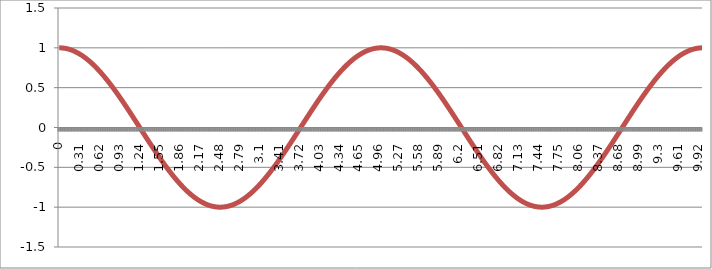
| Category | Series 0 |
|---|---|
| 0.0 | 1 |
| 0.01 | 1 |
| 0.02 | 1 |
| 0.03 | 0.999 |
| 0.04 | 0.999 |
| 0.05 | 0.998 |
| 0.060000000000000005 | 0.997 |
| 0.07 | 0.996 |
| 0.08 | 0.995 |
| 0.09 | 0.994 |
| 0.09999999999999999 | 0.992 |
| 0.10999999999999999 | 0.99 |
| 0.11999999999999998 | 0.989 |
| 0.12999999999999998 | 0.987 |
| 0.13999999999999999 | 0.985 |
| 0.15 | 0.982 |
| 0.16 | 0.98 |
| 0.17 | 0.977 |
| 0.18000000000000002 | 0.975 |
| 0.19000000000000003 | 0.972 |
| 0.20000000000000004 | 0.969 |
| 0.21000000000000005 | 0.965 |
| 0.22000000000000006 | 0.962 |
| 0.23000000000000007 | 0.959 |
| 0.24000000000000007 | 0.955 |
| 0.25000000000000006 | 0.951 |
| 0.26000000000000006 | 0.947 |
| 0.2700000000000001 | 0.943 |
| 0.2800000000000001 | 0.939 |
| 0.2900000000000001 | 0.934 |
| 0.3000000000000001 | 0.93 |
| 0.3100000000000001 | 0.925 |
| 0.3200000000000001 | 0.92 |
| 0.3300000000000001 | 0.915 |
| 0.34000000000000014 | 0.91 |
| 0.35000000000000014 | 0.905 |
| 0.36000000000000015 | 0.899 |
| 0.37000000000000016 | 0.894 |
| 0.38000000000000017 | 0.888 |
| 0.3900000000000002 | 0.882 |
| 0.4000000000000002 | 0.876 |
| 0.4100000000000002 | 0.87 |
| 0.4200000000000002 | 0.864 |
| 0.4300000000000002 | 0.858 |
| 0.4400000000000002 | 0.851 |
| 0.45000000000000023 | 0.844 |
| 0.46000000000000024 | 0.838 |
| 0.47000000000000025 | 0.831 |
| 0.48000000000000026 | 0.824 |
| 0.49000000000000027 | 0.816 |
| 0.5000000000000002 | 0.809 |
| 0.5100000000000002 | 0.802 |
| 0.5200000000000002 | 0.794 |
| 0.5300000000000002 | 0.786 |
| 0.5400000000000003 | 0.778 |
| 0.5500000000000003 | 0.771 |
| 0.5600000000000003 | 0.762 |
| 0.5700000000000003 | 0.754 |
| 0.5800000000000003 | 0.746 |
| 0.5900000000000003 | 0.738 |
| 0.6000000000000003 | 0.729 |
| 0.6100000000000003 | 0.72 |
| 0.6200000000000003 | 0.712 |
| 0.6300000000000003 | 0.703 |
| 0.6400000000000003 | 0.694 |
| 0.6500000000000004 | 0.685 |
| 0.6600000000000004 | 0.675 |
| 0.6700000000000004 | 0.666 |
| 0.6800000000000004 | 0.657 |
| 0.6900000000000004 | 0.647 |
| 0.7000000000000004 | 0.637 |
| 0.7100000000000004 | 0.628 |
| 0.7200000000000004 | 0.618 |
| 0.7300000000000004 | 0.608 |
| 0.7400000000000004 | 0.598 |
| 0.7500000000000004 | 0.588 |
| 0.7600000000000005 | 0.578 |
| 0.7700000000000005 | 0.567 |
| 0.7800000000000005 | 0.557 |
| 0.7900000000000005 | 0.546 |
| 0.8000000000000005 | 0.536 |
| 0.8100000000000005 | 0.525 |
| 0.8200000000000005 | 0.514 |
| 0.8300000000000005 | 0.504 |
| 0.8400000000000005 | 0.493 |
| 0.8500000000000005 | 0.482 |
| 0.8600000000000005 | 0.471 |
| 0.8700000000000006 | 0.46 |
| 0.8800000000000006 | 0.448 |
| 0.8900000000000006 | 0.437 |
| 0.9000000000000006 | 0.426 |
| 0.9100000000000006 | 0.414 |
| 0.9200000000000006 | 0.403 |
| 0.9300000000000006 | 0.391 |
| 0.9400000000000006 | 0.38 |
| 0.9500000000000006 | 0.368 |
| 0.9600000000000006 | 0.356 |
| 0.9700000000000006 | 0.345 |
| 0.9800000000000006 | 0.333 |
| 0.9900000000000007 | 0.321 |
| 1.0000000000000007 | 0.309 |
| 1.0100000000000007 | 0.297 |
| 1.0200000000000007 | 0.285 |
| 1.0300000000000007 | 0.273 |
| 1.0400000000000007 | 0.261 |
| 1.0500000000000007 | 0.249 |
| 1.0600000000000007 | 0.236 |
| 1.0700000000000007 | 0.224 |
| 1.0800000000000007 | 0.212 |
| 1.0900000000000007 | 0.2 |
| 1.1000000000000008 | 0.187 |
| 1.1100000000000008 | 0.175 |
| 1.1200000000000008 | 0.163 |
| 1.1300000000000008 | 0.15 |
| 1.1400000000000008 | 0.138 |
| 1.1500000000000008 | 0.125 |
| 1.1600000000000008 | 0.113 |
| 1.1700000000000008 | 0.1 |
| 1.1800000000000008 | 0.088 |
| 1.1900000000000008 | 0.075 |
| 1.2000000000000008 | 0.063 |
| 1.2100000000000009 | 0.05 |
| 1.2200000000000009 | 0.038 |
| 1.2300000000000009 | 0.025 |
| 1.2400000000000009 | 0.013 |
| 1.2500000000000009 | 0 |
| 1.260000000000001 | -0.013 |
| 1.270000000000001 | -0.025 |
| 1.280000000000001 | -0.038 |
| 1.290000000000001 | -0.05 |
| 1.300000000000001 | -0.063 |
| 1.310000000000001 | -0.075 |
| 1.320000000000001 | -0.088 |
| 1.330000000000001 | -0.1 |
| 1.340000000000001 | -0.113 |
| 1.350000000000001 | -0.125 |
| 1.360000000000001 | -0.138 |
| 1.370000000000001 | -0.15 |
| 1.380000000000001 | -0.163 |
| 1.390000000000001 | -0.175 |
| 1.400000000000001 | -0.187 |
| 1.410000000000001 | -0.2 |
| 1.420000000000001 | -0.212 |
| 1.430000000000001 | -0.224 |
| 1.440000000000001 | -0.236 |
| 1.450000000000001 | -0.249 |
| 1.460000000000001 | -0.261 |
| 1.470000000000001 | -0.273 |
| 1.480000000000001 | -0.285 |
| 1.490000000000001 | -0.297 |
| 1.500000000000001 | -0.309 |
| 1.5100000000000011 | -0.321 |
| 1.5200000000000011 | -0.333 |
| 1.5300000000000011 | -0.345 |
| 1.5400000000000011 | -0.356 |
| 1.5500000000000012 | -0.368 |
| 1.5600000000000012 | -0.38 |
| 1.5700000000000012 | -0.391 |
| 1.5800000000000012 | -0.403 |
| 1.5900000000000012 | -0.414 |
| 1.6000000000000012 | -0.426 |
| 1.6100000000000012 | -0.437 |
| 1.6200000000000012 | -0.448 |
| 1.6300000000000012 | -0.46 |
| 1.6400000000000012 | -0.471 |
| 1.6500000000000012 | -0.482 |
| 1.6600000000000013 | -0.493 |
| 1.6700000000000013 | -0.504 |
| 1.6800000000000013 | -0.514 |
| 1.6900000000000013 | -0.525 |
| 1.7000000000000013 | -0.536 |
| 1.7100000000000013 | -0.546 |
| 1.7200000000000013 | -0.557 |
| 1.7300000000000013 | -0.567 |
| 1.7400000000000013 | -0.578 |
| 1.7500000000000013 | -0.588 |
| 1.7600000000000013 | -0.598 |
| 1.7700000000000014 | -0.608 |
| 1.7800000000000014 | -0.618 |
| 1.7900000000000014 | -0.628 |
| 1.8000000000000014 | -0.637 |
| 1.8100000000000014 | -0.647 |
| 1.8200000000000014 | -0.657 |
| 1.8300000000000014 | -0.666 |
| 1.8400000000000014 | -0.675 |
| 1.8500000000000014 | -0.685 |
| 1.8600000000000014 | -0.694 |
| 1.8700000000000014 | -0.703 |
| 1.8800000000000014 | -0.712 |
| 1.8900000000000015 | -0.72 |
| 1.9000000000000015 | -0.729 |
| 1.9100000000000015 | -0.738 |
| 1.9200000000000015 | -0.746 |
| 1.9300000000000015 | -0.754 |
| 1.9400000000000015 | -0.762 |
| 1.9500000000000015 | -0.771 |
| 1.9600000000000015 | -0.778 |
| 1.9700000000000015 | -0.786 |
| 1.9800000000000015 | -0.794 |
| 1.9900000000000015 | -0.802 |
| 2.0000000000000013 | -0.809 |
| 2.010000000000001 | -0.816 |
| 2.020000000000001 | -0.824 |
| 2.0300000000000007 | -0.831 |
| 2.0400000000000005 | -0.838 |
| 2.0500000000000003 | -0.844 |
| 2.06 | -0.851 |
| 2.07 | -0.858 |
| 2.0799999999999996 | -0.864 |
| 2.0899999999999994 | -0.87 |
| 2.099999999999999 | -0.876 |
| 2.109999999999999 | -0.882 |
| 2.1199999999999988 | -0.888 |
| 2.1299999999999986 | -0.894 |
| 2.1399999999999983 | -0.899 |
| 2.149999999999998 | -0.905 |
| 2.159999999999998 | -0.91 |
| 2.1699999999999977 | -0.915 |
| 2.1799999999999975 | -0.92 |
| 2.1899999999999973 | -0.925 |
| 2.199999999999997 | -0.93 |
| 2.209999999999997 | -0.934 |
| 2.2199999999999966 | -0.939 |
| 2.2299999999999964 | -0.943 |
| 2.239999999999996 | -0.947 |
| 2.249999999999996 | -0.951 |
| 2.259999999999996 | -0.955 |
| 2.2699999999999956 | -0.959 |
| 2.2799999999999954 | -0.962 |
| 2.289999999999995 | -0.965 |
| 2.299999999999995 | -0.969 |
| 2.3099999999999947 | -0.972 |
| 2.3199999999999945 | -0.975 |
| 2.3299999999999943 | -0.977 |
| 2.339999999999994 | -0.98 |
| 2.349999999999994 | -0.982 |
| 2.3599999999999937 | -0.985 |
| 2.3699999999999934 | -0.987 |
| 2.3799999999999932 | -0.989 |
| 2.389999999999993 | -0.99 |
| 2.399999999999993 | -0.992 |
| 2.4099999999999926 | -0.994 |
| 2.4199999999999924 | -0.995 |
| 2.429999999999992 | -0.996 |
| 2.439999999999992 | -0.997 |
| 2.4499999999999917 | -0.998 |
| 2.4599999999999915 | -0.999 |
| 2.4699999999999913 | -0.999 |
| 2.479999999999991 | -1 |
| 2.489999999999991 | -1 |
| 2.4999999999999907 | -1 |
| 2.5099999999999905 | -1 |
| 2.5199999999999902 | -1 |
| 2.52999999999999 | -0.999 |
| 2.53999999999999 | -0.999 |
| 2.5499999999999896 | -0.998 |
| 2.5599999999999894 | -0.997 |
| 2.569999999999989 | -0.996 |
| 2.579999999999989 | -0.995 |
| 2.5899999999999888 | -0.994 |
| 2.5999999999999885 | -0.992 |
| 2.6099999999999883 | -0.99 |
| 2.619999999999988 | -0.989 |
| 2.629999999999988 | -0.987 |
| 2.6399999999999877 | -0.985 |
| 2.6499999999999875 | -0.982 |
| 2.6599999999999873 | -0.98 |
| 2.669999999999987 | -0.977 |
| 2.679999999999987 | -0.975 |
| 2.6899999999999866 | -0.972 |
| 2.6999999999999864 | -0.969 |
| 2.709999999999986 | -0.965 |
| 2.719999999999986 | -0.962 |
| 2.7299999999999858 | -0.959 |
| 2.7399999999999856 | -0.955 |
| 2.7499999999999853 | -0.951 |
| 2.759999999999985 | -0.947 |
| 2.769999999999985 | -0.943 |
| 2.7799999999999847 | -0.939 |
| 2.7899999999999845 | -0.934 |
| 2.7999999999999843 | -0.93 |
| 2.809999999999984 | -0.925 |
| 2.819999999999984 | -0.92 |
| 2.8299999999999836 | -0.915 |
| 2.8399999999999834 | -0.91 |
| 2.849999999999983 | -0.905 |
| 2.859999999999983 | -0.899 |
| 2.869999999999983 | -0.894 |
| 2.8799999999999826 | -0.888 |
| 2.8899999999999824 | -0.882 |
| 2.899999999999982 | -0.876 |
| 2.909999999999982 | -0.87 |
| 2.9199999999999817 | -0.864 |
| 2.9299999999999815 | -0.858 |
| 2.9399999999999813 | -0.851 |
| 2.949999999999981 | -0.844 |
| 2.959999999999981 | -0.838 |
| 2.9699999999999807 | -0.831 |
| 2.9799999999999804 | -0.824 |
| 2.9899999999999802 | -0.816 |
| 2.99999999999998 | -0.809 |
| 3.00999999999998 | -0.802 |
| 3.0199999999999796 | -0.794 |
| 3.0299999999999794 | -0.786 |
| 3.039999999999979 | -0.778 |
| 3.049999999999979 | -0.771 |
| 3.0599999999999787 | -0.762 |
| 3.0699999999999785 | -0.754 |
| 3.0799999999999783 | -0.746 |
| 3.089999999999978 | -0.738 |
| 3.099999999999978 | -0.729 |
| 3.1099999999999777 | -0.72 |
| 3.1199999999999775 | -0.712 |
| 3.1299999999999772 | -0.703 |
| 3.139999999999977 | -0.694 |
| 3.149999999999977 | -0.685 |
| 3.1599999999999766 | -0.675 |
| 3.1699999999999764 | -0.666 |
| 3.179999999999976 | -0.657 |
| 3.189999999999976 | -0.647 |
| 3.1999999999999758 | -0.637 |
| 3.2099999999999755 | -0.628 |
| 3.2199999999999753 | -0.618 |
| 3.229999999999975 | -0.608 |
| 3.239999999999975 | -0.598 |
| 3.2499999999999747 | -0.588 |
| 3.2599999999999745 | -0.578 |
| 3.2699999999999743 | -0.567 |
| 3.279999999999974 | -0.557 |
| 3.289999999999974 | -0.546 |
| 3.2999999999999736 | -0.536 |
| 3.3099999999999734 | -0.525 |
| 3.319999999999973 | -0.514 |
| 3.329999999999973 | -0.504 |
| 3.3399999999999728 | -0.493 |
| 3.3499999999999726 | -0.482 |
| 3.3599999999999723 | -0.471 |
| 3.369999999999972 | -0.46 |
| 3.379999999999972 | -0.448 |
| 3.3899999999999717 | -0.437 |
| 3.3999999999999715 | -0.426 |
| 3.4099999999999713 | -0.414 |
| 3.419999999999971 | -0.403 |
| 3.429999999999971 | -0.391 |
| 3.4399999999999706 | -0.38 |
| 3.4499999999999704 | -0.368 |
| 3.45999999999997 | -0.356 |
| 3.46999999999997 | -0.345 |
| 3.47999999999997 | -0.333 |
| 3.4899999999999696 | -0.321 |
| 3.4999999999999694 | -0.309 |
| 3.509999999999969 | -0.297 |
| 3.519999999999969 | -0.285 |
| 3.5299999999999687 | -0.273 |
| 3.5399999999999685 | -0.261 |
| 3.5499999999999683 | -0.249 |
| 3.559999999999968 | -0.236 |
| 3.569999999999968 | -0.224 |
| 3.5799999999999677 | -0.212 |
| 3.5899999999999674 | -0.2 |
| 3.5999999999999672 | -0.187 |
| 3.609999999999967 | -0.175 |
| 3.619999999999967 | -0.163 |
| 3.6299999999999666 | -0.15 |
| 3.6399999999999664 | -0.138 |
| 3.649999999999966 | -0.125 |
| 3.659999999999966 | -0.113 |
| 3.6699999999999657 | -0.1 |
| 3.6799999999999655 | -0.088 |
| 3.6899999999999653 | -0.075 |
| 3.699999999999965 | -0.063 |
| 3.709999999999965 | -0.05 |
| 3.7199999999999647 | -0.038 |
| 3.7299999999999645 | -0.025 |
| 3.7399999999999642 | -0.013 |
| 3.749999999999964 | 0 |
| 3.759999999999964 | 0.013 |
| 3.7699999999999636 | 0.025 |
| 3.7799999999999634 | 0.038 |
| 3.789999999999963 | 0.05 |
| 3.799999999999963 | 0.063 |
| 3.8099999999999627 | 0.075 |
| 3.8199999999999625 | 0.088 |
| 3.8299999999999623 | 0.1 |
| 3.839999999999962 | 0.113 |
| 3.849999999999962 | 0.125 |
| 3.8599999999999617 | 0.138 |
| 3.8699999999999615 | 0.15 |
| 3.8799999999999613 | 0.163 |
| 3.889999999999961 | 0.175 |
| 3.899999999999961 | 0.187 |
| 3.9099999999999606 | 0.2 |
| 3.9199999999999604 | 0.212 |
| 3.92999999999996 | 0.224 |
| 3.93999999999996 | 0.236 |
| 3.9499999999999598 | 0.249 |
| 3.9599999999999596 | 0.261 |
| 3.9699999999999593 | 0.273 |
| 3.979999999999959 | 0.285 |
| 3.989999999999959 | 0.297 |
| 3.9999999999999587 | 0.309 |
| 4.009999999999959 | 0.321 |
| 4.019999999999959 | 0.333 |
| 4.0299999999999585 | 0.345 |
| 4.039999999999958 | 0.356 |
| 4.049999999999958 | 0.368 |
| 4.059999999999958 | 0.38 |
| 4.069999999999958 | 0.391 |
| 4.079999999999957 | 0.403 |
| 4.089999999999957 | 0.414 |
| 4.099999999999957 | 0.426 |
| 4.109999999999957 | 0.437 |
| 4.119999999999957 | 0.448 |
| 4.129999999999956 | 0.46 |
| 4.139999999999956 | 0.471 |
| 4.149999999999956 | 0.482 |
| 4.159999999999956 | 0.493 |
| 4.1699999999999555 | 0.504 |
| 4.179999999999955 | 0.514 |
| 4.189999999999955 | 0.525 |
| 4.199999999999955 | 0.536 |
| 4.209999999999955 | 0.546 |
| 4.2199999999999545 | 0.557 |
| 4.229999999999954 | 0.567 |
| 4.239999999999954 | 0.578 |
| 4.249999999999954 | 0.588 |
| 4.259999999999954 | 0.598 |
| 4.269999999999953 | 0.608 |
| 4.279999999999953 | 0.618 |
| 4.289999999999953 | 0.628 |
| 4.299999999999953 | 0.637 |
| 4.3099999999999525 | 0.647 |
| 4.319999999999952 | 0.657 |
| 4.329999999999952 | 0.666 |
| 4.339999999999952 | 0.675 |
| 4.349999999999952 | 0.685 |
| 4.3599999999999515 | 0.694 |
| 4.369999999999951 | 0.703 |
| 4.379999999999951 | 0.712 |
| 4.389999999999951 | 0.72 |
| 4.399999999999951 | 0.729 |
| 4.40999999999995 | 0.738 |
| 4.41999999999995 | 0.746 |
| 4.42999999999995 | 0.754 |
| 4.43999999999995 | 0.762 |
| 4.4499999999999496 | 0.771 |
| 4.459999999999949 | 0.778 |
| 4.469999999999949 | 0.786 |
| 4.479999999999949 | 0.794 |
| 4.489999999999949 | 0.802 |
| 4.4999999999999485 | 0.809 |
| 4.509999999999948 | 0.816 |
| 4.519999999999948 | 0.824 |
| 4.529999999999948 | 0.831 |
| 4.539999999999948 | 0.838 |
| 4.549999999999947 | 0.844 |
| 4.559999999999947 | 0.851 |
| 4.569999999999947 | 0.858 |
| 4.579999999999947 | 0.864 |
| 4.589999999999947 | 0.87 |
| 4.599999999999946 | 0.876 |
| 4.609999999999946 | 0.882 |
| 4.619999999999946 | 0.888 |
| 4.629999999999946 | 0.894 |
| 4.6399999999999455 | 0.899 |
| 4.649999999999945 | 0.905 |
| 4.659999999999945 | 0.91 |
| 4.669999999999945 | 0.915 |
| 4.679999999999945 | 0.92 |
| 4.689999999999944 | 0.925 |
| 4.699999999999944 | 0.93 |
| 4.709999999999944 | 0.934 |
| 4.719999999999944 | 0.939 |
| 4.729999999999944 | 0.943 |
| 4.739999999999943 | 0.947 |
| 4.749999999999943 | 0.951 |
| 4.759999999999943 | 0.955 |
| 4.769999999999943 | 0.959 |
| 4.7799999999999425 | 0.962 |
| 4.789999999999942 | 0.965 |
| 4.799999999999942 | 0.969 |
| 4.809999999999942 | 0.972 |
| 4.819999999999942 | 0.975 |
| 4.8299999999999415 | 0.977 |
| 4.839999999999941 | 0.98 |
| 4.849999999999941 | 0.982 |
| 4.859999999999941 | 0.985 |
| 4.869999999999941 | 0.987 |
| 4.87999999999994 | 0.989 |
| 4.88999999999994 | 0.99 |
| 4.89999999999994 | 0.992 |
| 4.90999999999994 | 0.994 |
| 4.9199999999999395 | 0.995 |
| 4.929999999999939 | 0.996 |
| 4.939999999999939 | 0.997 |
| 4.949999999999939 | 0.998 |
| 4.959999999999939 | 0.999 |
| 4.9699999999999385 | 0.999 |
| 4.979999999999938 | 1 |
| 4.989999999999938 | 1 |
| 4.999999999999938 | 1 |
| 5.009999999999938 | 1 |
| 5.019999999999937 | 1 |
| 5.029999999999937 | 0.999 |
| 5.039999999999937 | 0.999 |
| 5.049999999999937 | 0.998 |
| 5.0599999999999365 | 0.997 |
| 5.069999999999936 | 0.996 |
| 5.079999999999936 | 0.995 |
| 5.089999999999936 | 0.994 |
| 5.099999999999936 | 0.992 |
| 5.1099999999999355 | 0.99 |
| 5.119999999999935 | 0.989 |
| 5.129999999999935 | 0.987 |
| 5.139999999999935 | 0.985 |
| 5.149999999999935 | 0.982 |
| 5.159999999999934 | 0.98 |
| 5.169999999999934 | 0.977 |
| 5.179999999999934 | 0.975 |
| 5.189999999999934 | 0.972 |
| 5.199999999999934 | 0.969 |
| 5.209999999999933 | 0.965 |
| 5.219999999999933 | 0.962 |
| 5.229999999999933 | 0.959 |
| 5.239999999999933 | 0.955 |
| 5.2499999999999325 | 0.951 |
| 5.259999999999932 | 0.947 |
| 5.269999999999932 | 0.943 |
| 5.279999999999932 | 0.939 |
| 5.289999999999932 | 0.934 |
| 5.299999999999931 | 0.93 |
| 5.309999999999931 | 0.925 |
| 5.319999999999931 | 0.92 |
| 5.329999999999931 | 0.915 |
| 5.339999999999931 | 0.91 |
| 5.34999999999993 | 0.905 |
| 5.35999999999993 | 0.899 |
| 5.36999999999993 | 0.894 |
| 5.37999999999993 | 0.888 |
| 5.3899999999999295 | 0.882 |
| 5.399999999999929 | 0.876 |
| 5.409999999999929 | 0.87 |
| 5.419999999999929 | 0.864 |
| 5.429999999999929 | 0.858 |
| 5.4399999999999284 | 0.851 |
| 5.449999999999928 | 0.844 |
| 5.459999999999928 | 0.838 |
| 5.469999999999928 | 0.831 |
| 5.479999999999928 | 0.824 |
| 5.489999999999927 | 0.816 |
| 5.499999999999927 | 0.809 |
| 5.509999999999927 | 0.802 |
| 5.519999999999927 | 0.794 |
| 5.5299999999999265 | 0.786 |
| 5.539999999999926 | 0.778 |
| 5.549999999999926 | 0.771 |
| 5.559999999999926 | 0.762 |
| 5.569999999999926 | 0.754 |
| 5.5799999999999255 | 0.746 |
| 5.589999999999925 | 0.738 |
| 5.599999999999925 | 0.729 |
| 5.609999999999925 | 0.72 |
| 5.619999999999925 | 0.712 |
| 5.629999999999924 | 0.703 |
| 5.639999999999924 | 0.694 |
| 5.649999999999924 | 0.685 |
| 5.659999999999924 | 0.675 |
| 5.6699999999999235 | 0.666 |
| 5.679999999999923 | 0.657 |
| 5.689999999999923 | 0.647 |
| 5.699999999999923 | 0.637 |
| 5.709999999999923 | 0.628 |
| 5.7199999999999225 | 0.618 |
| 5.729999999999922 | 0.608 |
| 5.739999999999922 | 0.598 |
| 5.749999999999922 | 0.588 |
| 5.759999999999922 | 0.578 |
| 5.769999999999921 | 0.567 |
| 5.779999999999921 | 0.557 |
| 5.789999999999921 | 0.546 |
| 5.799999999999921 | 0.536 |
| 5.809999999999921 | 0.525 |
| 5.81999999999992 | 0.514 |
| 5.82999999999992 | 0.504 |
| 5.83999999999992 | 0.493 |
| 5.84999999999992 | 0.482 |
| 5.8599999999999195 | 0.471 |
| 5.869999999999919 | 0.46 |
| 5.879999999999919 | 0.448 |
| 5.889999999999919 | 0.437 |
| 5.899999999999919 | 0.426 |
| 5.909999999999918 | 0.414 |
| 5.919999999999918 | 0.403 |
| 5.929999999999918 | 0.391 |
| 5.939999999999918 | 0.38 |
| 5.949999999999918 | 0.368 |
| 5.959999999999917 | 0.356 |
| 5.969999999999917 | 0.345 |
| 5.979999999999917 | 0.333 |
| 5.989999999999917 | 0.321 |
| 5.9999999999999165 | 0.309 |
| 6.009999999999916 | 0.297 |
| 6.019999999999916 | 0.285 |
| 6.029999999999916 | 0.273 |
| 6.039999999999916 | 0.261 |
| 6.0499999999999154 | 0.249 |
| 6.059999999999915 | 0.236 |
| 6.069999999999915 | 0.224 |
| 6.079999999999915 | 0.212 |
| 6.089999999999915 | 0.2 |
| 6.099999999999914 | 0.187 |
| 6.109999999999914 | 0.175 |
| 6.119999999999914 | 0.163 |
| 6.129999999999914 | 0.15 |
| 6.1399999999999135 | 0.138 |
| 6.149999999999913 | 0.125 |
| 6.159999999999913 | 0.113 |
| 6.169999999999913 | 0.1 |
| 6.179999999999913 | 0.088 |
| 6.1899999999999125 | 0.075 |
| 6.199999999999912 | 0.063 |
| 6.209999999999912 | 0.05 |
| 6.219999999999912 | 0.038 |
| 6.229999999999912 | 0.025 |
| 6.239999999999911 | 0.013 |
| 6.249999999999911 | 0 |
| 6.259999999999911 | -0.013 |
| 6.269999999999911 | -0.025 |
| 6.2799999999999105 | -0.038 |
| 6.28999999999991 | -0.05 |
| 6.29999999999991 | -0.063 |
| 6.30999999999991 | -0.075 |
| 6.31999999999991 | -0.088 |
| 6.3299999999999095 | -0.1 |
| 6.339999999999909 | -0.113 |
| 6.349999999999909 | -0.125 |
| 6.359999999999909 | -0.138 |
| 6.369999999999909 | -0.15 |
| 6.379999999999908 | -0.163 |
| 6.389999999999908 | -0.175 |
| 6.399999999999908 | -0.187 |
| 6.409999999999908 | -0.2 |
| 6.419999999999908 | -0.212 |
| 6.429999999999907 | -0.224 |
| 6.439999999999907 | -0.236 |
| 6.449999999999907 | -0.249 |
| 6.459999999999907 | -0.261 |
| 6.4699999999999065 | -0.273 |
| 6.479999999999906 | -0.285 |
| 6.489999999999906 | -0.297 |
| 6.499999999999906 | -0.309 |
| 6.509999999999906 | -0.321 |
| 6.519999999999905 | -0.333 |
| 6.529999999999905 | -0.345 |
| 6.539999999999905 | -0.356 |
| 6.549999999999905 | -0.368 |
| 6.559999999999905 | -0.38 |
| 6.569999999999904 | -0.391 |
| 6.579999999999904 | -0.403 |
| 6.589999999999904 | -0.414 |
| 6.599999999999904 | -0.426 |
| 6.6099999999999035 | -0.437 |
| 6.619999999999903 | -0.448 |
| 6.629999999999903 | -0.46 |
| 6.639999999999903 | -0.471 |
| 6.649999999999903 | -0.482 |
| 6.659999999999902 | -0.493 |
| 6.669999999999902 | -0.504 |
| 6.679999999999902 | -0.514 |
| 6.689999999999902 | -0.525 |
| 6.699999999999902 | -0.536 |
| 6.709999999999901 | -0.546 |
| 6.719999999999901 | -0.557 |
| 6.729999999999901 | -0.567 |
| 6.739999999999901 | -0.578 |
| 6.7499999999999005 | -0.588 |
| 6.7599999999999 | -0.598 |
| 6.7699999999999 | -0.608 |
| 6.7799999999999 | -0.618 |
| 6.7899999999999 | -0.628 |
| 6.7999999999998995 | -0.637 |
| 6.809999999999899 | -0.647 |
| 6.819999999999899 | -0.657 |
| 6.829999999999899 | -0.666 |
| 6.839999999999899 | -0.675 |
| 6.849999999999898 | -0.685 |
| 6.859999999999898 | -0.694 |
| 6.869999999999898 | -0.703 |
| 6.879999999999898 | -0.712 |
| 6.8899999999998975 | -0.72 |
| 6.899999999999897 | -0.729 |
| 6.909999999999897 | -0.738 |
| 6.919999999999897 | -0.746 |
| 6.929999999999897 | -0.754 |
| 6.9399999999998965 | -0.762 |
| 6.949999999999896 | -0.771 |
| 6.959999999999896 | -0.778 |
| 6.969999999999896 | -0.786 |
| 6.979999999999896 | -0.794 |
| 6.989999999999895 | -0.802 |
| 6.999999999999895 | -0.809 |
| 7.009999999999895 | -0.816 |
| 7.019999999999895 | -0.824 |
| 7.0299999999998946 | -0.831 |
| 7.039999999999894 | -0.838 |
| 7.049999999999894 | -0.844 |
| 7.059999999999894 | -0.851 |
| 7.069999999999894 | -0.858 |
| 7.0799999999998935 | -0.864 |
| 7.089999999999893 | -0.87 |
| 7.099999999999893 | -0.876 |
| 7.109999999999893 | -0.882 |
| 7.119999999999893 | -0.888 |
| 7.129999999999892 | -0.894 |
| 7.139999999999892 | -0.899 |
| 7.149999999999892 | -0.905 |
| 7.159999999999892 | -0.91 |
| 7.169999999999892 | -0.915 |
| 7.179999999999891 | -0.92 |
| 7.189999999999891 | -0.925 |
| 7.199999999999891 | -0.93 |
| 7.209999999999891 | -0.934 |
| 7.2199999999998905 | -0.939 |
| 7.22999999999989 | -0.943 |
| 7.23999999999989 | -0.947 |
| 7.24999999999989 | -0.951 |
| 7.25999999999989 | -0.955 |
| 7.269999999999889 | -0.959 |
| 7.279999999999889 | -0.962 |
| 7.289999999999889 | -0.965 |
| 7.299999999999889 | -0.969 |
| 7.309999999999889 | -0.972 |
| 7.319999999999888 | -0.975 |
| 7.329999999999888 | -0.977 |
| 7.339999999999888 | -0.98 |
| 7.349999999999888 | -0.982 |
| 7.3599999999998875 | -0.985 |
| 7.369999999999887 | -0.987 |
| 7.379999999999887 | -0.989 |
| 7.389999999999887 | -0.99 |
| 7.399999999999887 | -0.992 |
| 7.4099999999998865 | -0.994 |
| 7.419999999999886 | -0.995 |
| 7.429999999999886 | -0.996 |
| 7.439999999999886 | -0.997 |
| 7.449999999999886 | -0.998 |
| 7.459999999999885 | -0.999 |
| 7.469999999999885 | -0.999 |
| 7.479999999999885 | -1 |
| 7.489999999999885 | -1 |
| 7.4999999999998845 | -1 |
| 7.509999999999884 | -1 |
| 7.519999999999884 | -1 |
| 7.529999999999884 | -0.999 |
| 7.539999999999884 | -0.999 |
| 7.5499999999998835 | -0.998 |
| 7.559999999999883 | -0.997 |
| 7.569999999999883 | -0.996 |
| 7.579999999999883 | -0.995 |
| 7.589999999999883 | -0.994 |
| 7.599999999999882 | -0.992 |
| 7.609999999999882 | -0.99 |
| 7.619999999999882 | -0.989 |
| 7.629999999999882 | -0.987 |
| 7.6399999999998816 | -0.985 |
| 7.649999999999881 | -0.982 |
| 7.659999999999881 | -0.98 |
| 7.669999999999881 | -0.977 |
| 7.679999999999881 | -0.975 |
| 7.6899999999998805 | -0.972 |
| 7.69999999999988 | -0.969 |
| 7.70999999999988 | -0.965 |
| 7.71999999999988 | -0.962 |
| 7.72999999999988 | -0.959 |
| 7.739999999999879 | -0.955 |
| 7.749999999999879 | -0.951 |
| 7.759999999999879 | -0.947 |
| 7.769999999999879 | -0.943 |
| 7.779999999999879 | -0.939 |
| 7.789999999999878 | -0.934 |
| 7.799999999999878 | -0.93 |
| 7.809999999999878 | -0.925 |
| 7.819999999999878 | -0.92 |
| 7.8299999999998775 | -0.915 |
| 7.839999999999877 | -0.91 |
| 7.849999999999877 | -0.905 |
| 7.859999999999877 | -0.899 |
| 7.869999999999877 | -0.894 |
| 7.879999999999876 | -0.888 |
| 7.889999999999876 | -0.882 |
| 7.899999999999876 | -0.876 |
| 7.909999999999876 | -0.87 |
| 7.919999999999876 | -0.864 |
| 7.929999999999875 | -0.858 |
| 7.939999999999875 | -0.851 |
| 7.949999999999875 | -0.844 |
| 7.959999999999875 | -0.838 |
| 7.9699999999998745 | -0.831 |
| 7.979999999999874 | -0.824 |
| 7.989999999999874 | -0.816 |
| 7.999999999999874 | -0.809 |
| 8.009999999999874 | -0.802 |
| 8.019999999999873 | -0.794 |
| 8.029999999999873 | -0.786 |
| 8.039999999999873 | -0.778 |
| 8.049999999999873 | -0.771 |
| 8.059999999999873 | -0.762 |
| 8.069999999999872 | -0.754 |
| 8.079999999999872 | -0.746 |
| 8.089999999999872 | -0.738 |
| 8.099999999999872 | -0.729 |
| 8.109999999999872 | -0.72 |
| 8.119999999999871 | -0.712 |
| 8.129999999999871 | -0.703 |
| 8.139999999999871 | -0.694 |
| 8.14999999999987 | -0.685 |
| 8.15999999999987 | -0.675 |
| 8.16999999999987 | -0.666 |
| 8.17999999999987 | -0.657 |
| 8.18999999999987 | -0.647 |
| 8.19999999999987 | -0.637 |
| 8.20999999999987 | -0.628 |
| 8.21999999999987 | -0.618 |
| 8.229999999999869 | -0.608 |
| 8.239999999999869 | -0.598 |
| 8.249999999999869 | -0.588 |
| 8.259999999999868 | -0.578 |
| 8.269999999999868 | -0.567 |
| 8.279999999999868 | -0.557 |
| 8.289999999999868 | -0.546 |
| 8.299999999999867 | -0.536 |
| 8.309999999999867 | -0.525 |
| 8.319999999999867 | -0.514 |
| 8.329999999999867 | -0.504 |
| 8.339999999999867 | -0.493 |
| 8.349999999999866 | -0.482 |
| 8.359999999999866 | -0.471 |
| 8.369999999999866 | -0.46 |
| 8.379999999999866 | -0.448 |
| 8.389999999999866 | -0.437 |
| 8.399999999999865 | -0.426 |
| 8.409999999999865 | -0.414 |
| 8.419999999999865 | -0.403 |
| 8.429999999999865 | -0.391 |
| 8.439999999999864 | -0.38 |
| 8.449999999999864 | -0.368 |
| 8.459999999999864 | -0.356 |
| 8.469999999999864 | -0.345 |
| 8.479999999999864 | -0.333 |
| 8.489999999999863 | -0.321 |
| 8.499999999999863 | -0.309 |
| 8.509999999999863 | -0.297 |
| 8.519999999999863 | -0.285 |
| 8.529999999999863 | -0.273 |
| 8.539999999999862 | -0.261 |
| 8.549999999999862 | -0.249 |
| 8.559999999999862 | -0.236 |
| 8.569999999999862 | -0.224 |
| 8.579999999999862 | -0.212 |
| 8.589999999999861 | -0.2 |
| 8.599999999999861 | -0.187 |
| 8.60999999999986 | -0.175 |
| 8.61999999999986 | -0.163 |
| 8.62999999999986 | -0.15 |
| 8.63999999999986 | -0.138 |
| 8.64999999999986 | -0.125 |
| 8.65999999999986 | -0.113 |
| 8.66999999999986 | -0.1 |
| 8.67999999999986 | -0.088 |
| 8.68999999999986 | -0.075 |
| 8.699999999999859 | -0.063 |
| 8.709999999999859 | -0.05 |
| 8.719999999999859 | -0.038 |
| 8.729999999999858 | -0.025 |
| 8.739999999999858 | -0.013 |
| 8.749999999999858 | 0 |
| 8.759999999999858 | 0.013 |
| 8.769999999999857 | 0.025 |
| 8.779999999999857 | 0.038 |
| 8.789999999999857 | 0.05 |
| 8.799999999999857 | 0.063 |
| 8.809999999999857 | 0.075 |
| 8.819999999999856 | 0.088 |
| 8.829999999999856 | 0.1 |
| 8.839999999999856 | 0.113 |
| 8.849999999999856 | 0.125 |
| 8.859999999999856 | 0.138 |
| 8.869999999999855 | 0.15 |
| 8.879999999999855 | 0.163 |
| 8.889999999999855 | 0.175 |
| 8.899999999999855 | 0.187 |
| 8.909999999999854 | 0.2 |
| 8.919999999999854 | 0.212 |
| 8.929999999999854 | 0.224 |
| 8.939999999999854 | 0.236 |
| 8.949999999999854 | 0.249 |
| 8.959999999999853 | 0.261 |
| 8.969999999999853 | 0.273 |
| 8.979999999999853 | 0.285 |
| 8.989999999999853 | 0.297 |
| 8.999999999999853 | 0.309 |
| 9.009999999999852 | 0.321 |
| 9.019999999999852 | 0.333 |
| 9.029999999999852 | 0.345 |
| 9.039999999999852 | 0.356 |
| 9.049999999999851 | 0.368 |
| 9.059999999999851 | 0.38 |
| 9.069999999999851 | 0.391 |
| 9.07999999999985 | 0.403 |
| 9.08999999999985 | 0.414 |
| 9.09999999999985 | 0.426 |
| 9.10999999999985 | 0.437 |
| 9.11999999999985 | 0.448 |
| 9.12999999999985 | 0.46 |
| 9.13999999999985 | 0.471 |
| 9.14999999999985 | 0.482 |
| 9.15999999999985 | 0.493 |
| 9.169999999999849 | 0.504 |
| 9.179999999999849 | 0.514 |
| 9.189999999999849 | 0.525 |
| 9.199999999999848 | 0.536 |
| 9.209999999999848 | 0.546 |
| 9.219999999999848 | 0.557 |
| 9.229999999999848 | 0.567 |
| 9.239999999999847 | 0.578 |
| 9.249999999999847 | 0.588 |
| 9.259999999999847 | 0.598 |
| 9.269999999999847 | 0.608 |
| 9.279999999999847 | 0.618 |
| 9.289999999999846 | 0.628 |
| 9.299999999999846 | 0.637 |
| 9.309999999999846 | 0.647 |
| 9.319999999999846 | 0.657 |
| 9.329999999999846 | 0.666 |
| 9.339999999999845 | 0.675 |
| 9.349999999999845 | 0.685 |
| 9.359999999999845 | 0.694 |
| 9.369999999999845 | 0.703 |
| 9.379999999999844 | 0.712 |
| 9.389999999999844 | 0.72 |
| 9.399999999999844 | 0.729 |
| 9.409999999999844 | 0.738 |
| 9.419999999999844 | 0.746 |
| 9.429999999999843 | 0.754 |
| 9.439999999999843 | 0.762 |
| 9.449999999999843 | 0.771 |
| 9.459999999999843 | 0.778 |
| 9.469999999999843 | 0.786 |
| 9.479999999999842 | 0.794 |
| 9.489999999999842 | 0.802 |
| 9.499999999999842 | 0.809 |
| 9.509999999999842 | 0.816 |
| 9.519999999999841 | 0.824 |
| 9.529999999999841 | 0.831 |
| 9.539999999999841 | 0.838 |
| 9.54999999999984 | 0.844 |
| 9.55999999999984 | 0.851 |
| 9.56999999999984 | 0.858 |
| 9.57999999999984 | 0.864 |
| 9.58999999999984 | 0.87 |
| 9.59999999999984 | 0.876 |
| 9.60999999999984 | 0.882 |
| 9.61999999999984 | 0.888 |
| 9.62999999999984 | 0.894 |
| 9.639999999999839 | 0.899 |
| 9.649999999999839 | 0.905 |
| 9.659999999999838 | 0.91 |
| 9.669999999999838 | 0.915 |
| 9.679999999999838 | 0.92 |
| 9.689999999999838 | 0.925 |
| 9.699999999999838 | 0.93 |
| 9.709999999999837 | 0.934 |
| 9.719999999999837 | 0.939 |
| 9.729999999999837 | 0.943 |
| 9.739999999999837 | 0.947 |
| 9.749999999999837 | 0.951 |
| 9.759999999999836 | 0.955 |
| 9.769999999999836 | 0.959 |
| 9.779999999999836 | 0.962 |
| 9.789999999999836 | 0.965 |
| 9.799999999999836 | 0.969 |
| 9.809999999999835 | 0.972 |
| 9.819999999999835 | 0.975 |
| 9.829999999999835 | 0.977 |
| 9.839999999999835 | 0.98 |
| 9.849999999999834 | 0.982 |
| 9.859999999999834 | 0.985 |
| 9.869999999999834 | 0.987 |
| 9.879999999999834 | 0.989 |
| 9.889999999999834 | 0.99 |
| 9.899999999999833 | 0.992 |
| 9.909999999999833 | 0.994 |
| 9.919999999999833 | 0.995 |
| 9.929999999999833 | 0.996 |
| 9.939999999999833 | 0.997 |
| 9.949999999999832 | 0.998 |
| 9.959999999999832 | 0.999 |
| 9.969999999999832 | 0.999 |
| 9.979999999999832 | 1 |
| 9.989999999999831 | 1 |
| 9.999999999999831 | 1 |